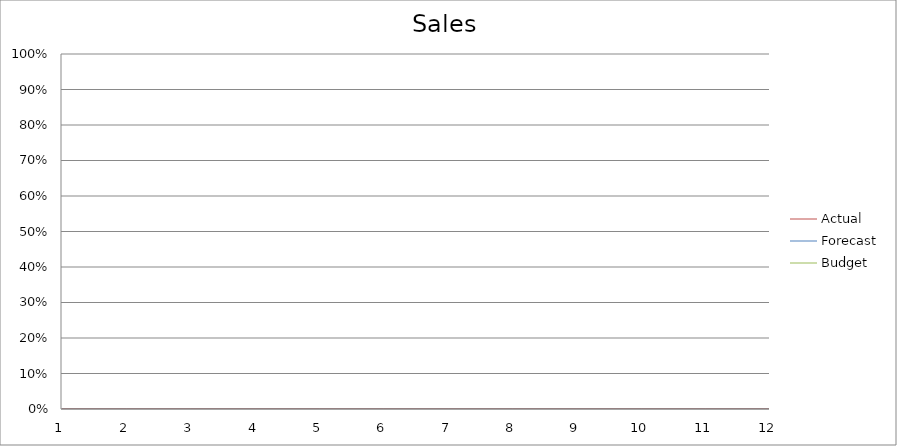
| Category | Budget | Forecast | Actual |
|---|---|---|---|
| 0 | 2900 | 2320 | 2750 |
| 1 | 1620 | 2740 | 2280 |
| 2 | 1820 | 1230 | 2200 |
| 3 | 1800 | 2210 | 2750 |
| 4 | 680 | 2610 | 2010 |
| 5 | 2260 | 1000 | 2730 |
| 6 | 2650 | 2520 | 1680 |
| 7 | 620 | 2940 | 2310 |
| 8 | 3230 | 3110 | 1600 |
| 9 | 860 | 660 | 3040 |
| 10 | 1260 | 2920 | 3350 |
| 11 | 1460 | 2120 | 720 |